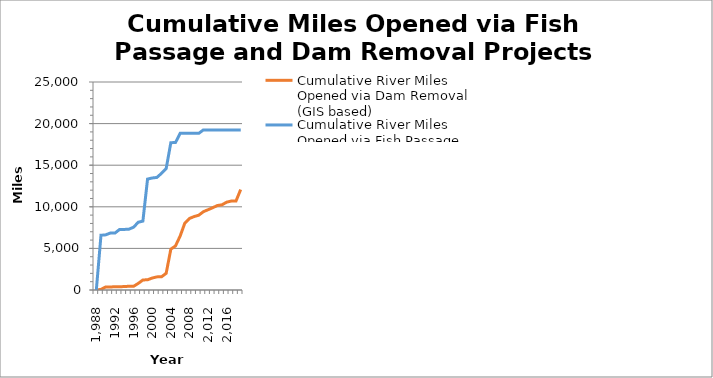
| Category | Cumulative River Miles Opened via Dam Removal (GIS based) | Cumulative River Miles Opened via Fish Passage (GIS based) |
|---|---|---|
| 1988 | 0 | 0 |
| 1989 | 71.619 | 6580.464 |
| 1990 | 366.987 | 6627.139 |
| 1991 | 369.218 | 6844.634 |
| 1992 | 382.745 | 6844.634 |
| 1993 | 382.745 | 7276.891 |
| 1994 | 419.236 | 7280.447 |
| 1995 | 445.698 | 7309.676 |
| 1996 | 445.698 | 7546.759 |
| 1997 | 790.421 | 8144.293 |
| 1998 | 1207.45 | 8279.674 |
| 1999 | 1228.965 | 13331.606 |
| 2000 | 1436.672 | 13463.275 |
| 2001 | 1576.851 | 13528.359 |
| 2002 | 1584.972 | 14021.183 |
| 2003 | 2008.836 | 14585.218 |
| 2004 | 4905.797 | 17706.926 |
| 2005 | 5297.495 | 17723.711 |
| 2006 | 6482.065 | 18825.856 |
| 2007 | 8034.116 | 18825.856 |
| 2008 | 8601.49 | 18825.856 |
| 2009 | 8826.177 | 18825.856 |
| 2010 | 8989.098 | 18825.856 |
| 2011 | 9413.705 | 19242.432 |
| 2012 | 9649.288 | 19242.432 |
| 2013 | 9892.015 | 19242.432 |
| 2014 | 10154.503 | 19242.432 |
| 2015 | 10242.82 | 19242.432 |
| 2016 | 10560.003 | 19242.432 |
| 2017 | 10691.959 | 19242.432 |
| 2018 | 10702.539 | 19242.432 |
| 2019 | 12070.749 | 19242.432 |